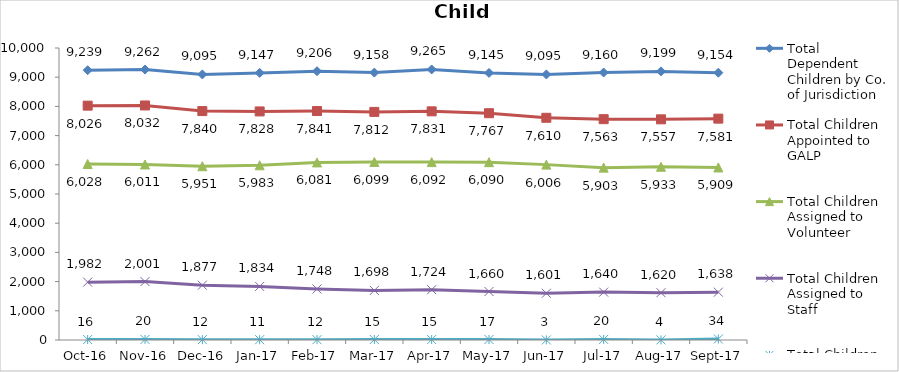
| Category | Total Dependent Children by Co. of Jurisdiction | Total Children Appointed to GALP | Total Children Assigned to Volunteer | Total Children Assigned to Staff | Total Children Unassigned |
|---|---|---|---|---|---|
| 2016-10-01 | 9239 | 8026 | 6028 | 1982 | 16 |
| 2016-11-01 | 9262 | 8032 | 6011 | 2001 | 20 |
| 2016-12-01 | 9095 | 7840 | 5951 | 1877 | 12 |
| 2017-01-01 | 9147 | 7828 | 5983 | 1834 | 11 |
| 2017-02-01 | 9206 | 7841 | 6081 | 1748 | 12 |
| 2017-03-01 | 9158 | 7812 | 6099 | 1698 | 15 |
| 2017-04-01 | 9265 | 7831 | 6092 | 1724 | 15 |
| 2017-05-01 | 9145 | 7767 | 6090 | 1660 | 17 |
| 2017-06-01 | 9095 | 7610 | 6006 | 1601 | 3 |
| 2017-07-01 | 9160 | 7563 | 5903 | 1640 | 20 |
| 2017-08-01 | 9199 | 7557 | 5933 | 1620 | 4 |
| 2017-09-01 | 9154 | 7581 | 5909 | 1638 | 34 |